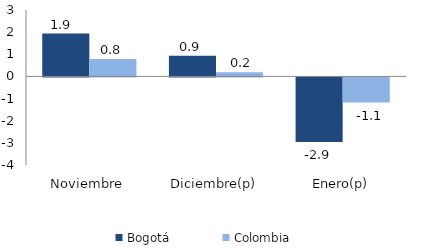
| Category | Bogotá | Colombia |
|---|---|---|
| Noviembre | 1.935 | 0.783 |
| Diciembre(p) | 0.939 | 0.191 |
| Enero(p) | -2.916 | -1.138 |